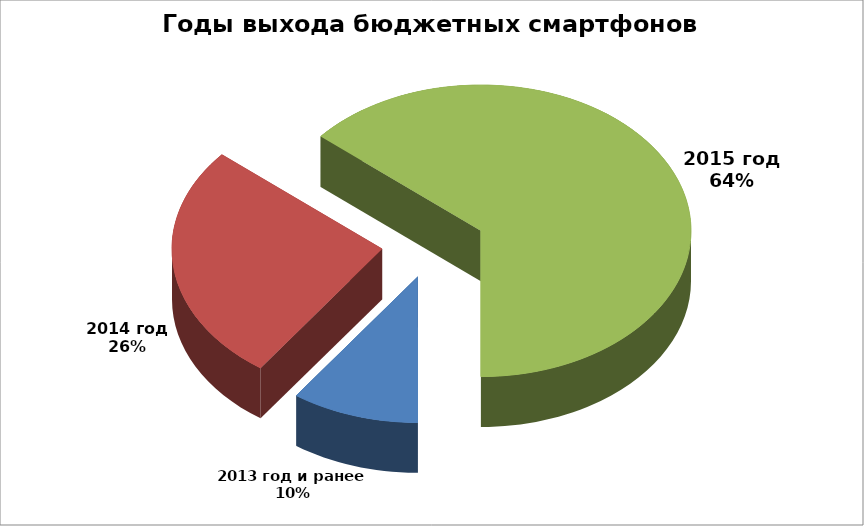
| Category | Series 0 |
|---|---|
| 2013 год и ранее  | 16 |
| 2014 год | 43 |
| 2015 год | 104 |